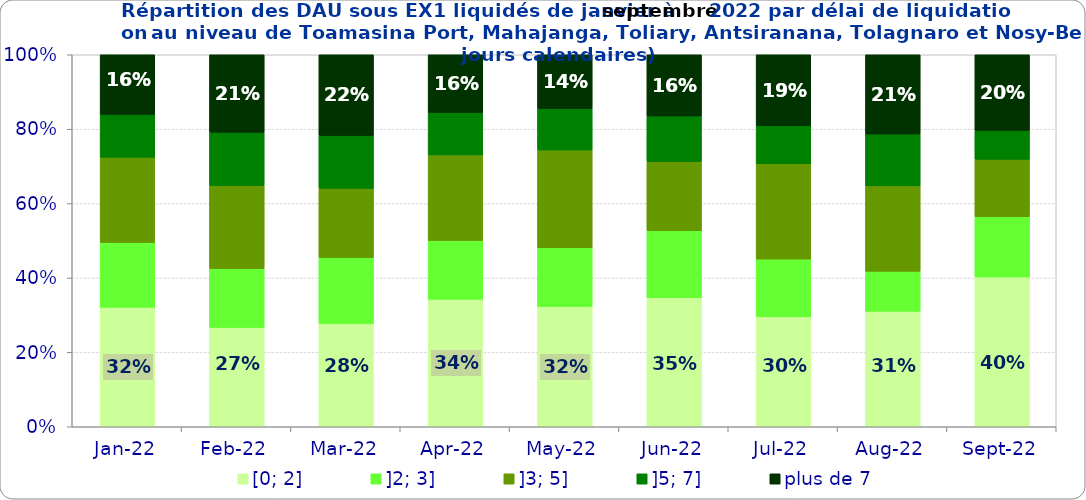
| Category | [0; 2] | ]2; 3] | ]3; 5] | ]5; 7] | plus de 7 |
|---|---|---|---|---|---|
| 2022-01-01 | 0.321 | 0.174 | 0.229 | 0.115 | 0.161 |
| 2022-02-01 | 0.267 | 0.158 | 0.223 | 0.143 | 0.208 |
| 2022-03-01 | 0.278 | 0.177 | 0.186 | 0.142 | 0.217 |
| 2022-04-01 | 0.343 | 0.158 | 0.23 | 0.114 | 0.155 |
| 2022-05-01 | 0.323 | 0.158 | 0.262 | 0.111 | 0.145 |
| 2022-06-01 | 0.347 | 0.18 | 0.186 | 0.122 | 0.165 |
| 2022-07-01 | 0.296 | 0.155 | 0.256 | 0.102 | 0.191 |
| 2022-08-01 | 0.31 | 0.107 | 0.23 | 0.139 | 0.213 |
| 2022-09-01 | 0.403 | 0.162 | 0.154 | 0.078 | 0.204 |